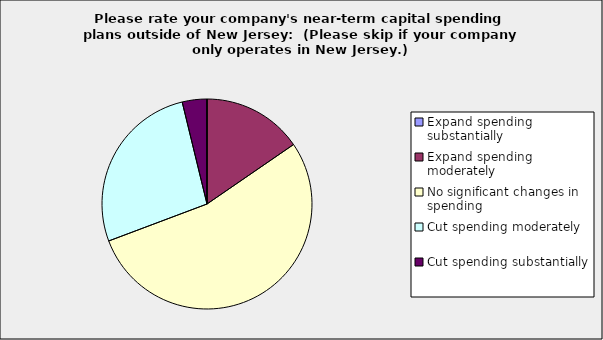
| Category | Series 0 |
|---|---|
| Expand spending substantially | 0 |
| Expand spending moderately | 0.154 |
| No significant changes in spending | 0.538 |
| Cut spending moderately | 0.269 |
| Cut spending substantially | 0.038 |